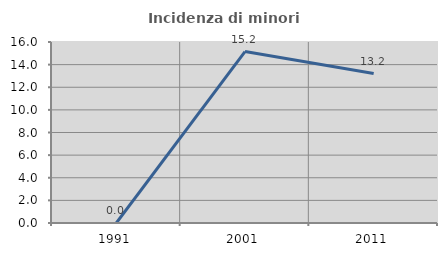
| Category | Incidenza di minori stranieri |
|---|---|
| 1991.0 | 0 |
| 2001.0 | 15.152 |
| 2011.0 | 13.208 |